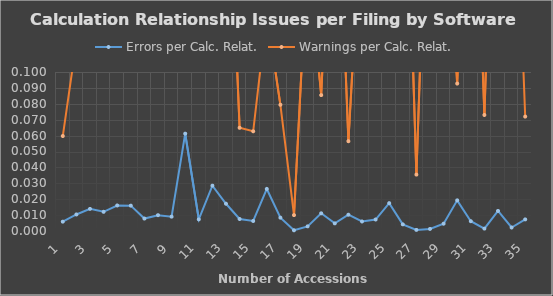
| Category | Errors per Calc. Relat. | Warnings per Calc. Relat. |
|---|---|---|
| 1.0 | 0.006 | 0.06 |
| 2.0 | 0.01 | 0.119 |
| 3.0 | 0.014 | 0.183 |
| 4.0 | 0.012 | 0.121 |
| 5.0 | 0.016 | 0.218 |
| 6.0 | 0.016 | 0.124 |
| 7.0 | 0.008 | 0.118 |
| 8.0 | 0.01 | 0.157 |
| 9.0 | 0.009 | 0.124 |
| 10.0 | 0.061 | 0.241 |
| 11.0 | 0.007 | 0.114 |
| 12.0 | 0.029 | 0.191 |
| 13.0 | 0.017 | 0.271 |
| 14.0 | 0.008 | 0.065 |
| 15.0 | 0.006 | 0.063 |
| 16.0 | 0.026 | 0.137 |
| 17.0 | 0.008 | 0.079 |
| 18.0 | 0 | 0.01 |
| 19.0 | 0.003 | 0.175 |
| 20.0 | 0.011 | 0.085 |
| 21.0 | 0.005 | 0.276 |
| 22.0 | 0.01 | 0.056 |
| 23.0 | 0.006 | 0.209 |
| 24.0 | 0.007 | 0.126 |
| 25.0 | 0.017 | 0.106 |
| 26.0 | 0.004 | 0.311 |
| 27.0 | 0.001 | 0.035 |
| 28.0 | 0.001 | 0.286 |
| 29.0 | 0.005 | 0.197 |
| 30.0 | 0.019 | 0.093 |
| 31.0 | 0.006 | 0.311 |
| 32.0 | 0.002 | 0.073 |
| 33.0 | 0.013 | 0.336 |
| 34.0 | 0.002 | 0.295 |
| 35.0 | 0.007 | 0.072 |